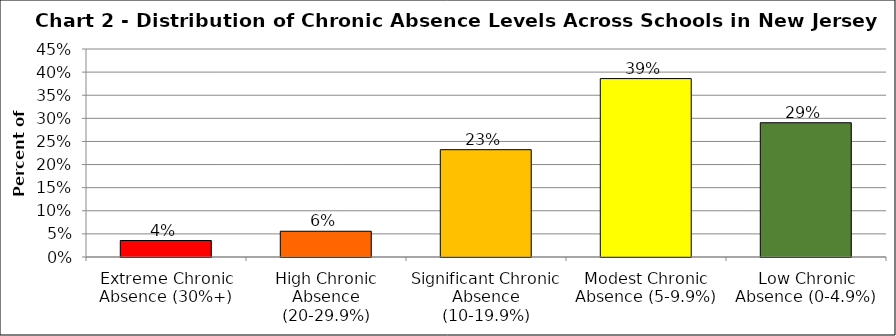
| Category | Series 1 |
|---|---|
| Extreme Chronic Absence (30%+) | 0.036 |
| High Chronic Absence (20-29.9%) | 0.056 |
| Significant Chronic Absence (10-19.9%) | 0.232 |
| Modest Chronic Absence (5-9.9%) | 0.386 |
| Low Chronic Absence (0-4.9%) | 0.29 |